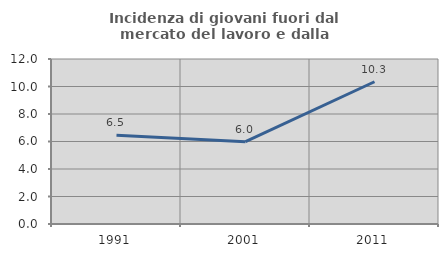
| Category | Incidenza di giovani fuori dal mercato del lavoro e dalla formazione  |
|---|---|
| 1991.0 | 6.457 |
| 2001.0 | 5.983 |
| 2011.0 | 10.345 |